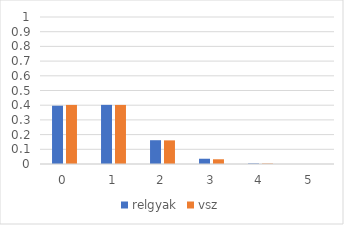
| Category | relgyak | vsz |
|---|---|---|
| 0.0 | 0.396 | 0.402 |
| 1.0 | 0.402 | 0.402 |
| 2.0 | 0.162 | 0.161 |
| 3.0 | 0.036 | 0.032 |
| 4.0 | 0.004 | 0.003 |
| 5.0 | 0 | 0 |